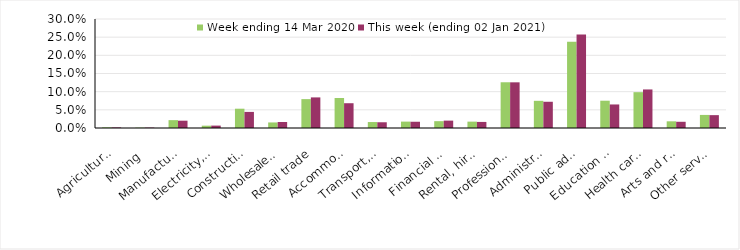
| Category | Week ending 14 Mar 2020 | This week (ending 02 Jan 2021) |
|---|---|---|
| Agriculture, forestry and fishing | 0.002 | 0.002 |
| Mining | 0.001 | 0.001 |
| Manufacturing | 0.022 | 0.02 |
| Electricity, gas, water and waste services | 0.006 | 0.007 |
| Construction | 0.053 | 0.044 |
| Wholesale trade | 0.015 | 0.017 |
| Retail trade | 0.08 | 0.084 |
| Accommodation and food services | 0.083 | 0.068 |
| Transport, postal and warehousing | 0.016 | 0.016 |
| Information media and telecommunications | 0.018 | 0.017 |
| Financial and insurance services | 0.019 | 0.02 |
| Rental, hiring and real estate services | 0.018 | 0.017 |
| Professional, scientific and technical services | 0.126 | 0.126 |
| Administrative and support services | 0.075 | 0.072 |
| Public administration and safety | 0.237 | 0.257 |
| Education and training | 0.075 | 0.065 |
| Health care and social assistance | 0.099 | 0.106 |
| Arts and recreation services | 0.018 | 0.017 |
| Other services | 0.036 | 0.035 |